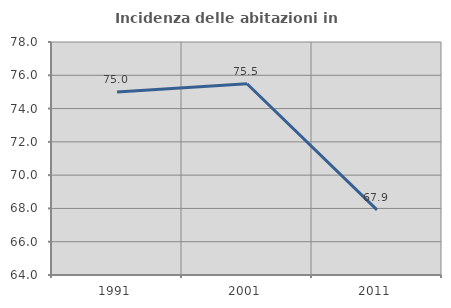
| Category | Incidenza delle abitazioni in proprietà  |
|---|---|
| 1991.0 | 75 |
| 2001.0 | 75.491 |
| 2011.0 | 67.916 |